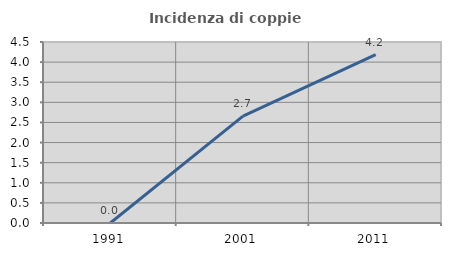
| Category | Incidenza di coppie miste |
|---|---|
| 1991.0 | 0 |
| 2001.0 | 2.658 |
| 2011.0 | 4.184 |